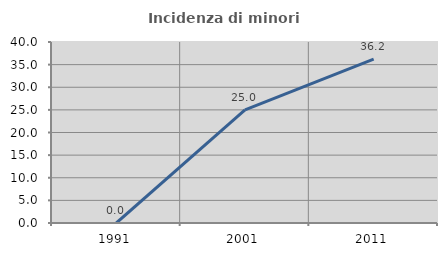
| Category | Incidenza di minori stranieri |
|---|---|
| 1991.0 | 0 |
| 2001.0 | 25 |
| 2011.0 | 36.207 |